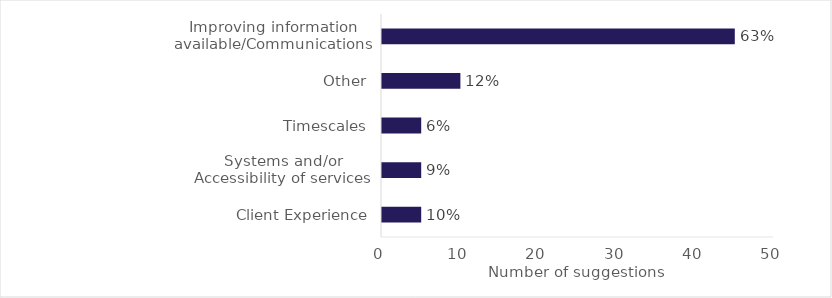
| Category | Series 0 |
|---|---|
| Client Experience | 5 |
| Systems and/or Accessibility of services | 5 |
| Timescales | 5 |
| Other | 10 |
| Improving information available/Communications | 45 |